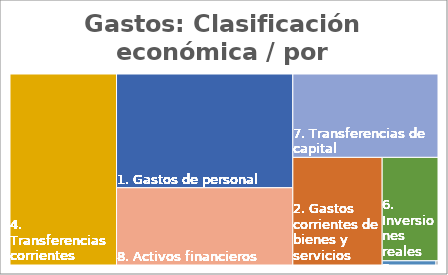
| Category | Series 0 |
|---|---|
| 1. Gastos de personal | 0.245 |
| 2. Gastos corrientes de bienes y servicios | 0.118 |
| 3. Gastos financieros | 0 |
| 4. Transferencias corrientes | 0.249 |
| 5. Fondo de contigencia y otros imprevistos | 0.003 |
| 6. Inversiones reales | 0.071 |
| 7. Transferencias de capital | 0.148 |
| 8. Activos financieros | 0.167 |